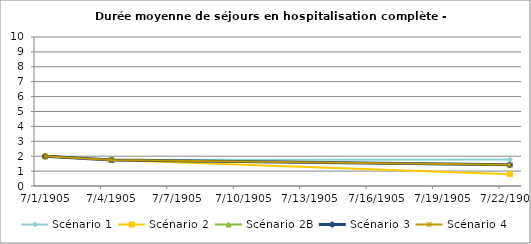
| Category | Scénario 1 | Scénario 2 | Scénario 2B | Scénario 3 | Scénario 4 |
|---|---|---|---|---|---|
| 2009.0 | 1.989 | 1.989 | 1.989 | 1.989 | 1.989 |
| 2012.0 | 1.745 | 1.745 | 1.745 | 1.745 | 1.745 |
| 2030.0 | 1.776 | 0.793 | 1.424 | 1.424 | 1.424 |